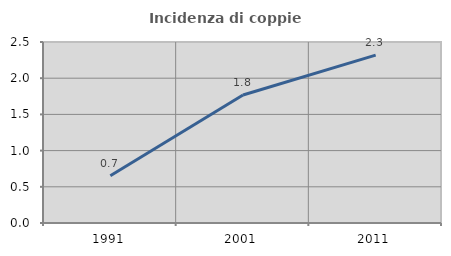
| Category | Incidenza di coppie miste |
|---|---|
| 1991.0 | 0.654 |
| 2001.0 | 1.768 |
| 2011.0 | 2.319 |